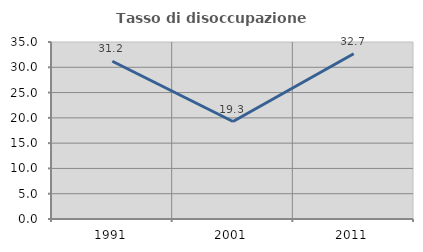
| Category | Tasso di disoccupazione giovanile  |
|---|---|
| 1991.0 | 31.192 |
| 2001.0 | 19.277 |
| 2011.0 | 32.686 |